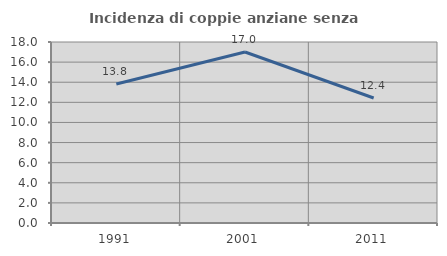
| Category | Incidenza di coppie anziane senza figli  |
|---|---|
| 1991.0 | 13.821 |
| 2001.0 | 17.003 |
| 2011.0 | 12.429 |